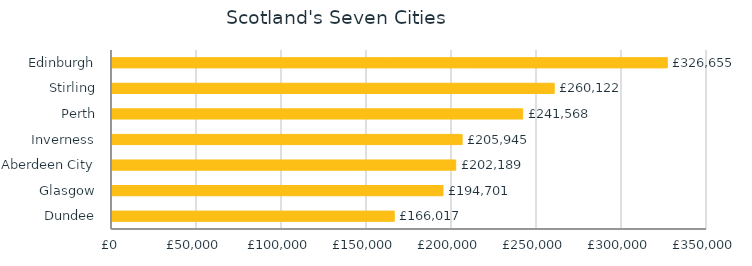
| Category | Series 0 |
|---|---|
| Dundee | 166016.785 |
| Glasgow | 194701.214 |
| Aberdeen City | 202189.278 |
| Inverness | 205945.097 |
| Perth | 241567.911 |
| Stirling | 260121.58 |
| Edinburgh | 326655.425 |